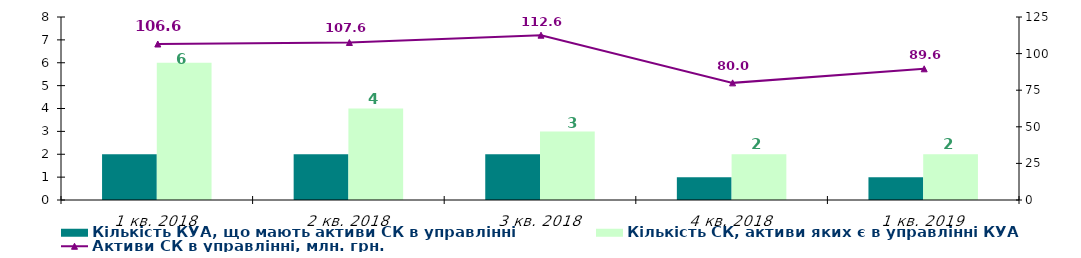
| Category | Кількість КУА, що мають активи СК в управлінні | Кількість СК, активи яких є в управлінні КУА |
|---|---|---|
| 1 кв. 2018 | 2 | 6 |
| 2 кв. 2018 | 2 | 4 |
| 3 кв. 2018 | 2 | 3 |
| 4 кв. 2018 | 1 | 2 |
| 1 кв. 2019 | 1 | 2 |